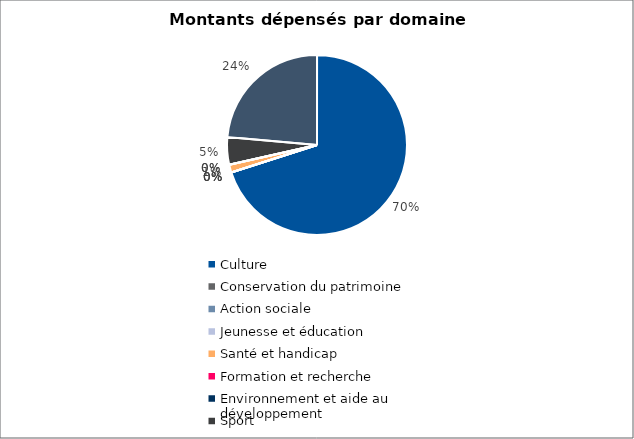
| Category | Series 0 |
|---|---|
| Culture | 700921 |
| Conservation du patrimoine | 0 |
| Action sociale | 0 |
| Jeunesse et éducation | 0 |
| Santé et handicap | 14000 |
| Formation et recherche | 0 |
| Environnement et aide au
développement | 0 |
| Sport | 49500 |
| Autres projets d’utilité publique | 236064.35 |